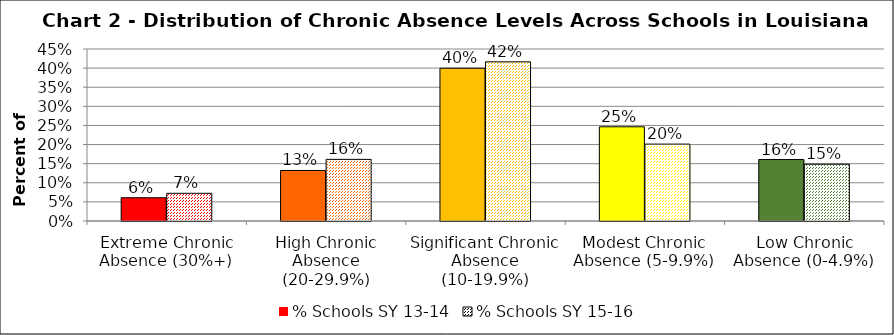
| Category | % Schools SY 13-14 | % Schools SY 15-16 |
|---|---|---|
| Extreme Chronic Absence (30%+) | 0.061 | 0.072 |
| High Chronic Absence (20-29.9%) | 0.132 | 0.161 |
| Significant Chronic Absence (10-19.9%) | 0.4 | 0.416 |
| Modest Chronic Absence (5-9.9%) | 0.246 | 0.201 |
| Low Chronic Absence (0-4.9%) | 0.161 | 0.149 |